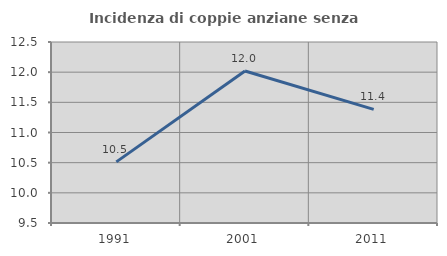
| Category | Incidenza di coppie anziane senza figli  |
|---|---|
| 1991.0 | 10.513 |
| 2001.0 | 12.019 |
| 2011.0 | 11.384 |